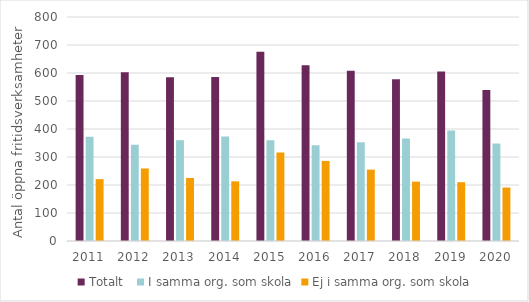
| Category | Totalt  | I samma org. som skola | Ej i samma org. som skola |
|---|---|---|---|
| 2011.0 | 593 | 372 | 221 |
| 2012.0 | 603 | 344 | 259 |
| 2013.0 | 585 | 360 | 225 |
| 2014.0 | 586 | 373 | 213 |
| 2015.0 | 676 | 360 | 316 |
| 2016.0 | 628 | 342 | 286 |
| 2017.0 | 608 | 353 | 255 |
| 2018.0 | 578 | 366 | 212 |
| 2019.0 | 605 | 395 | 210 |
| 2020.0 | 539 | 348 | 191 |